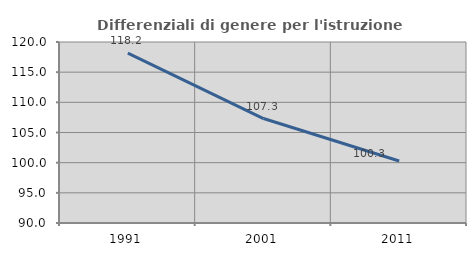
| Category | Differenziali di genere per l'istruzione superiore |
|---|---|
| 1991.0 | 118.167 |
| 2001.0 | 107.316 |
| 2011.0 | 100.28 |